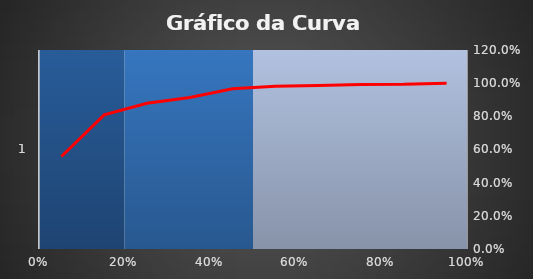
| Category | Series 0 | Series 1 | Series 2 | Series 3 | Series 4 | Series 5 | Series 6 | Series 7 | Series 8 | Series 9 |
|---|---|---|---|---|---|---|---|---|---|---|
| 0 |  | 2 |  |  | 3 |  |  |  |  | 5 |